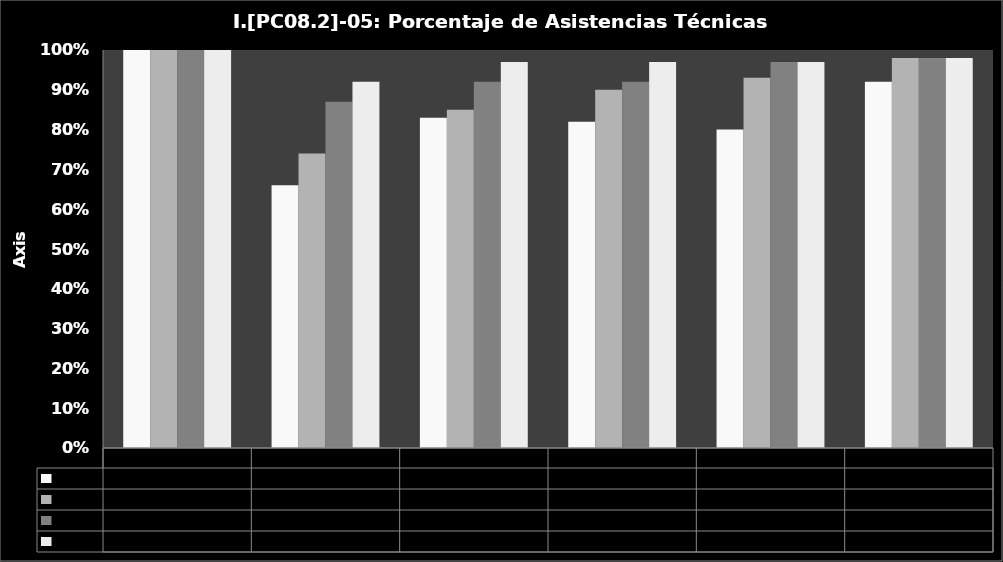
| Category | 2 días | 5 días | 10 días | 20 días |
|---|---|---|---|---|
| 2009.0 | 1 | 1 | 1 | 1 |
| 2010.0 | 0.66 | 0.74 | 0.87 | 0.92 |
| 2011.0 | 0.83 | 0.85 | 0.92 | 0.97 |
| 2012.0 | 0.82 | 0.9 | 0.92 | 0.97 |
| 2013.0 | 0.8 | 0.93 | 0.97 | 0.97 |
| 2014.0 | 0.92 | 0.98 | 0.98 | 0.98 |